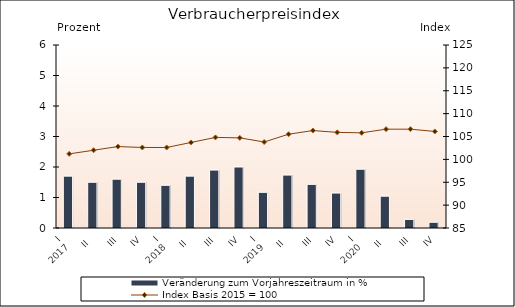
| Category | Veränderung zum Vorjahreszeitraum in % |
|---|---|
| 0 | 1.7 |
| 1 | 1.5 |
| 2 | 1.6 |
| 3 | 1.5 |
| 4 | 1.4 |
| 5 | 1.7 |
| 6 | 1.9 |
| 7 | 2 |
| 8 | 1.17 |
| 9 | 1.736 |
| 10 | 1.431 |
| 11 | 1.146 |
| 12 | 1.927 |
| 13 | 1.043 |
| 14 | 0.282 |
| 15 | 0.189 |